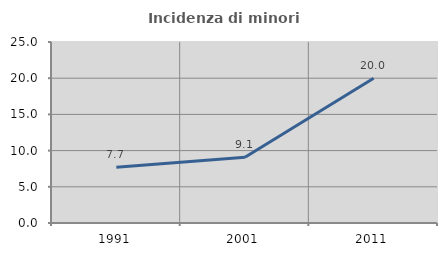
| Category | Incidenza di minori stranieri |
|---|---|
| 1991.0 | 7.692 |
| 2001.0 | 9.091 |
| 2011.0 | 20 |